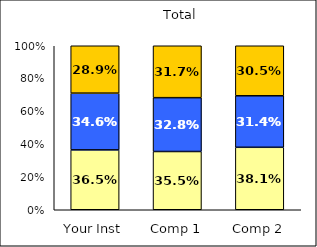
| Category | Low Science Identity | Average Science Identity | High Science Identity |
|---|---|---|---|
| Your Inst | 0.365 | 0.346 | 0.289 |
| Comp 1 | 0.355 | 0.328 | 0.317 |
| Comp 2 | 0.381 | 0.314 | 0.305 |